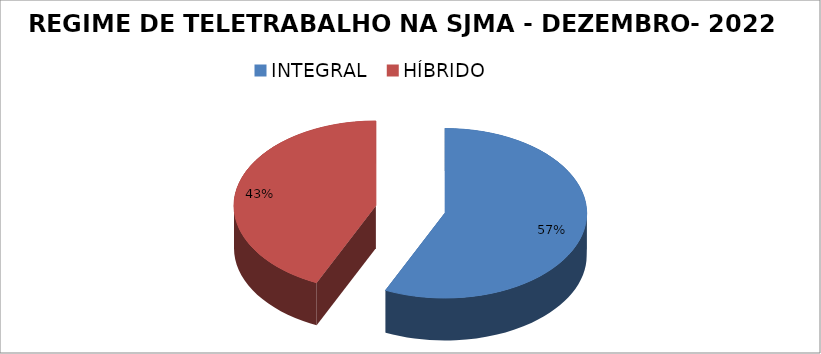
| Category | Series 0 |
|---|---|
| INTEGRAL | 83 |
| HÍBRIDO | 63 |